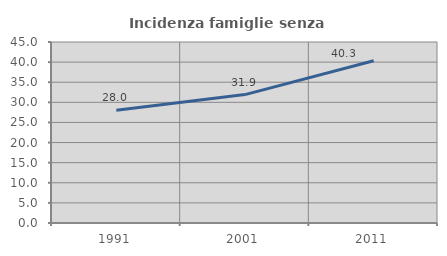
| Category | Incidenza famiglie senza nuclei |
|---|---|
| 1991.0 | 28.045 |
| 2001.0 | 31.926 |
| 2011.0 | 40.342 |